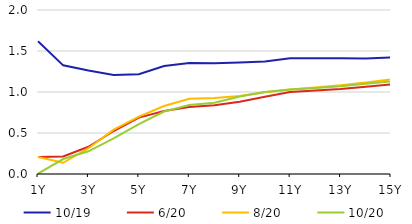
| Category | 10/19 | 6/20 | 8/20 | 10/20 |
|---|---|---|---|---|
|  1Y | 1.618 | 0.208 | 0.208 | 0.005 |
|  2Y | 1.325 | 0.213 | 0.137 | 0.183 |
|  3Y | 1.262 | 0.332 | 0.314 | 0.277 |
|  4Y | 1.208 | 0.524 | 0.54 | 0.436 |
|  5Y | 1.216 | 0.687 | 0.701 | 0.608 |
|  6Y | 1.316 | 0.769 | 0.829 | 0.762 |
|  7Y | 1.353 | 0.817 | 0.917 | 0.842 |
|  8Y | 1.35 | 0.839 | 0.927 | 0.868 |
|  9Y | 1.36 | 0.882 | 0.951 | 0.944 |
|  10Y | 1.373 | 0.942 | 0.996 | 1 |
|  11Y | 1.411 | 1 | 1.031 | 1.03 |
|  12Y | 1.411 | 1.018 | 1.056 | 1.05 |
|  13Y | 1.41 | 1.036 | 1.081 | 1.07 |
|  14Y | 1.41 | 1.063 | 1.117 | 1.1 |
|  15Y | 1.421 | 1.094 | 1.155 | 1.13 |